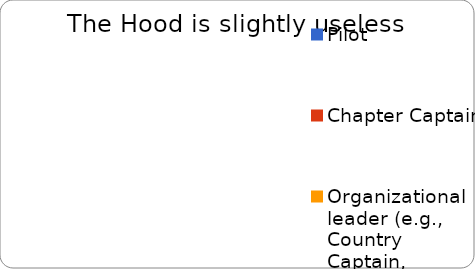
| Category | Slightly useless |
|---|---|
| Pilot | 0 |
| Chapter Captain | 0 |
| Organizational leader (e.g., Country Captain, member of The Hub) | 0 |